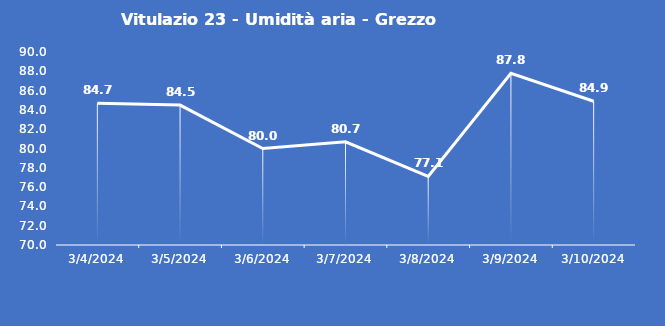
| Category | Vitulazio 23 - Umidità aria - Grezzo (%) |
|---|---|
| 3/4/24 | 84.7 |
| 3/5/24 | 84.5 |
| 3/6/24 | 80 |
| 3/7/24 | 80.7 |
| 3/8/24 | 77.1 |
| 3/9/24 | 87.8 |
| 3/10/24 | 84.9 |